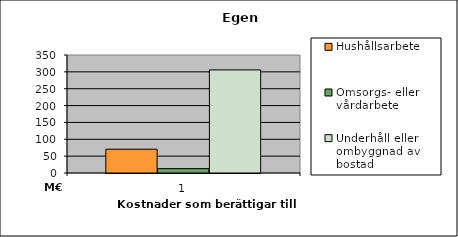
| Category | Hushållsarbete | Omsorgs- eller vårdarbete | Underhåll eller ombyggnad av bostad |
|---|---|---|---|
| 0 | 70575725.24 | 12963626.86 | 305746923.44 |